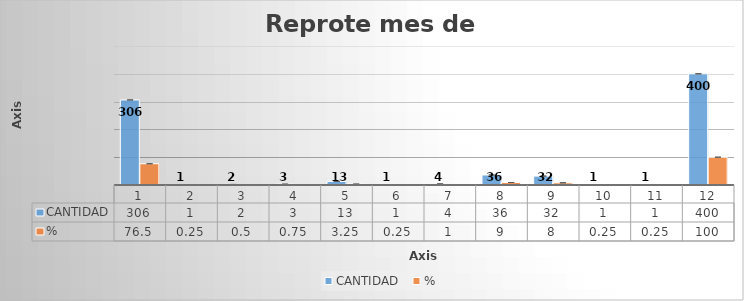
| Category | CANTIDAD  | % |
|---|---|---|
| 0 | 306 | 76.5 |
| 1 | 1 | 0.25 |
| 2 | 2 | 0.5 |
| 3 | 3 | 0.75 |
| 4 | 13 | 3.25 |
| 5 | 1 | 0.25 |
| 6 | 4 | 1 |
| 7 | 36 | 9 |
| 8 | 32 | 8 |
| 9 | 1 | 0.25 |
| 10 | 1 | 0.25 |
| 11 | 400 | 100 |